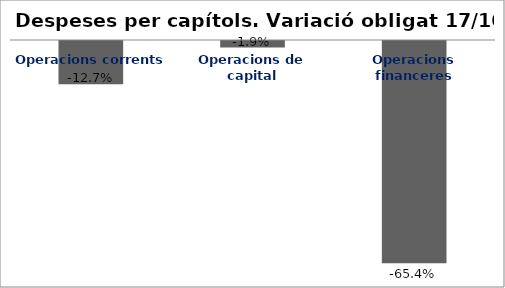
| Category | Series 0 |
|---|---|
| Operacions corrents | -0.127 |
| Operacions de capital | -0.019 |
| Operacions financeres | -0.654 |